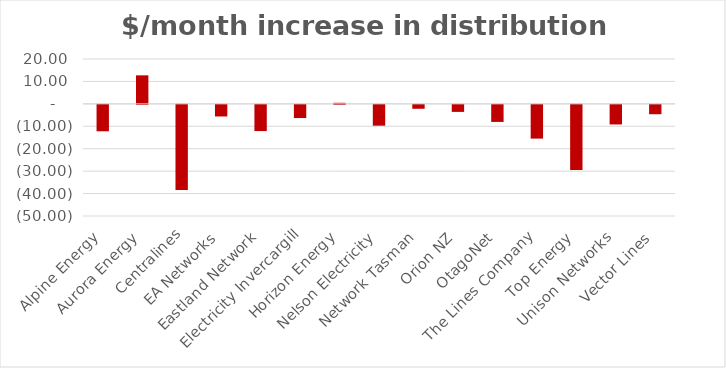
| Category | $/month increase in distribution prices |
|---|---|
| Alpine Energy | -11.784 |
| Aurora Energy | 12.713 |
| Centralines | -38.009 |
| EA Networks | -5.177 |
| Eastland Network | -11.683 |
| Electricity Invercargill | -5.879 |
| Horizon Energy | 0.469 |
| Nelson Electricity | -9.288 |
| Network Tasman | -1.748 |
| Orion NZ | -3.138 |
| OtagoNet | -7.616 |
| The Lines Company | -15.048 |
| Top Energy | -29.033 |
| Unison Networks | -8.74 |
| Vector Lines | -4.172 |